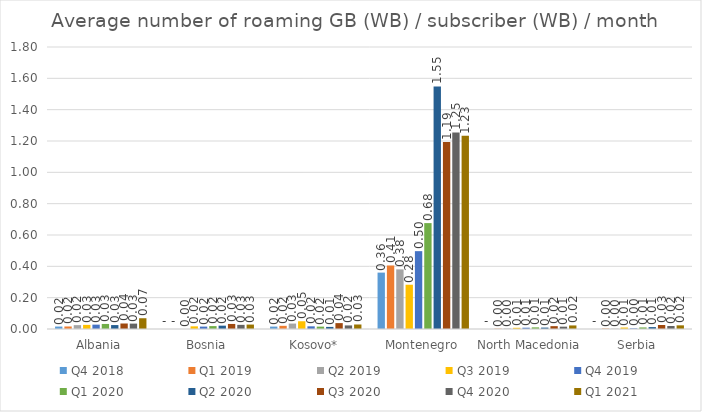
| Category | Q4 2018 | Q1 2019 | Q2 2019 | Q3 2019 | Q4 2019 | Q1 2020 | Q2 2020 | Q3 2020 | Q4 2020 | Q1 2021 |
|---|---|---|---|---|---|---|---|---|---|---|
| Albania | 0.016 | 0.016 | 0.025 | 0.026 | 0.028 | 0.032 | 0.025 | 0.035 | 0.034 | 0.069 |
| Bosnia | 0 | 0 | 0 | 0.017 | 0.015 | 0.019 | 0.021 | 0.032 | 0.027 | 0.028 |
| Kosovo* | 0.015 | 0.02 | 0.035 | 0.049 | 0.017 | 0.015 | 0.013 | 0.038 | 0.023 | 0.029 |
| Montenegro | 0.36 | 0.405 | 0.381 | 0.283 | 0.497 | 0.676 | 1.549 | 1.194 | 1.254 | 1.233 |
| North Macedonia | 0 | 0.002 | 0.003 | 0.008 | 0.008 | 0.01 | 0.009 | 0.018 | 0.015 | 0.023 |
| Serbia | 0 | 0.003 | 0.002 | 0.009 | 0.004 | 0.01 | 0.012 | 0.025 | 0.019 | 0.023 |